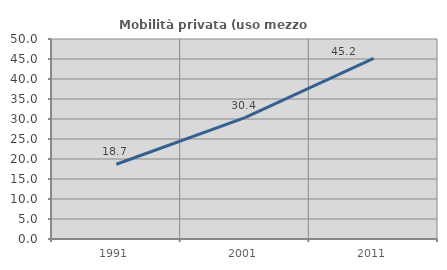
| Category | Mobilità privata (uso mezzo privato) |
|---|---|
| 1991.0 | 18.679 |
| 2001.0 | 30.357 |
| 2011.0 | 45.183 |